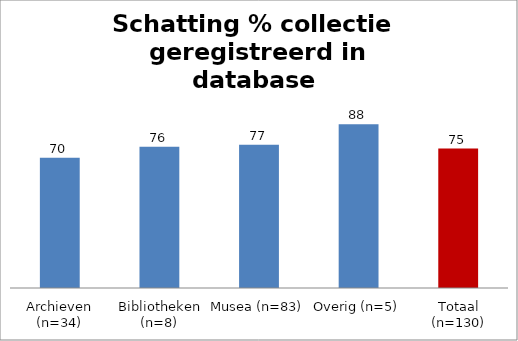
| Category | Series 0 |
|---|---|
| Archieven (n=34) | 70 |
| Bibliotheken (n=8) | 76 |
| Musea (n=83) | 77 |
| Overig (n=5) | 88 |
| Totaal (n=130) | 75 |